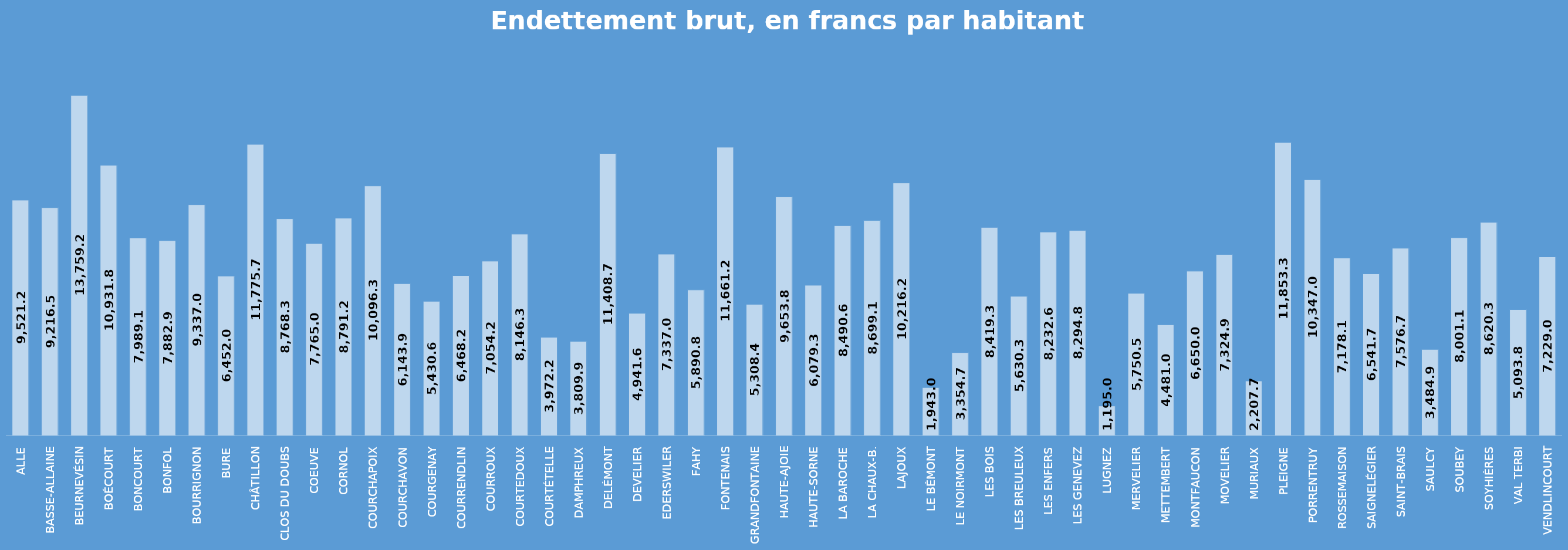
| Category | Brut par habitant |
|---|---|
| Alle | 9521.263 |
| Basse-Allaine | 9216.516 |
| Beurnevésin | 13759.279 |
| Boécourt | 10931.844 |
| Boncourt | 7989.171 |
| Bonfol | 7882.99 |
| Bourrignon | 9337.037 |
| Bure | 6452.08 |
| Châtillon | 11775.711 |
| Clos du Doubs | 8768.336 |
| Coeuve | 7765.055 |
| Cornol | 8791.213 |
| Courchapoix | 10096.369 |
| Courchavon | 6143.994 |
| Courgenay | 5430.631 |
| Courrendlin | 6468.248 |
| Courroux | 7054.213 |
| Courtedoux | 8146.37 |
| Courtételle | 3972.286 |
| Damphreux | 3809.976 |
| Delémont | 11408.697 |
| Develier | 4941.658 |
| Ederswiler | 7337.081 |
| Fahy | 5890.877 |
| Fontenais | 11661.222 |
| Grandfontaine | 5308.421 |
| Haute-Ajoie | 9653.833 |
| Haute-Sorne | 6079.31 |
| La Baroche | 8490.654 |
| La Chaux-B. | 8699.16 |
| Lajoux | 10216.27 |
| Le Bémont | 1943.036 |
| Le Noirmont | 3354.794 |
| Les Bois | 8419.357 |
| Les Breuleux | 5630.325 |
| Les Enfers | 8232.639 |
| Les Genevez | 8294.856 |
| Lugnez | 1195.068 |
| Mervelier | 5750.534 |
| Mettembert | 4481.044 |
| Montfaucon | 6650.017 |
| Movelier | 7324.898 |
| Muriaux | 2207.767 |
| Pleigne | 11853.385 |
| Porrentruy | 10347.085 |
| Rossemaison | 7178.117 |
| Saignelégier | 6541.781 |
| Saint-Brais | 7576.713 |
| Saulcy | 3484.986 |
| Soubey | 8001.19 |
| Soyhières | 8620.296 |
| Val Terbi | 5093.818 |
| Vendlincourt | 7229.026 |